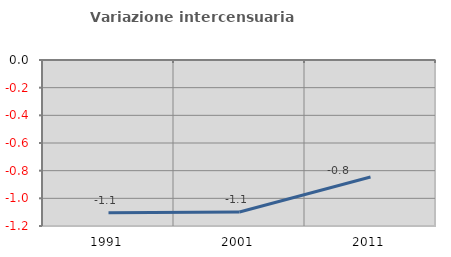
| Category | Variazione intercensuaria annua |
|---|---|
| 1991.0 | -1.105 |
| 2001.0 | -1.099 |
| 2011.0 | -0.846 |